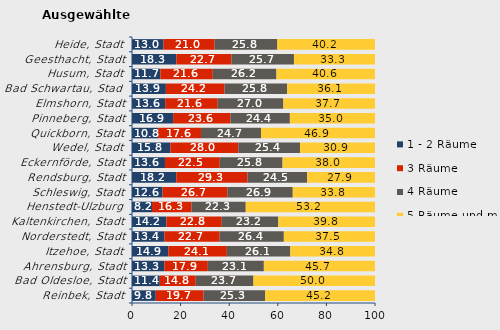
| Category | 1 - 2 Räume | 3 Räume | 4 Räume | 5 Räume und mehr |
|---|---|---|---|---|
| Reinbek, Stadt | 9.788 | 19.687 | 25.333 | 45.192 |
| Bad Oldesloe, Stadt | 11.438 | 14.807 | 23.739 | 50.016 |
| Ahrensburg, Stadt | 13.311 | 17.899 | 23.051 | 45.738 |
| Itzehoe, Stadt | 14.946 | 24.097 | 26.113 | 34.844 |
| Norderstedt, Stadt | 13.386 | 22.683 | 26.416 | 37.515 |
| Kaltenkirchen, Stadt | 14.152 | 22.8 | 23.243 | 39.804 |
| Henstedt-Ulzburg | 8.218 | 16.253 | 22.34 | 53.189 |
| Schleswig, Stadt | 12.588 | 26.651 | 26.924 | 33.837 |
| Rendsburg, Stadt | 18.233 | 29.318 | 24.533 | 27.916 |
| Eckernförde, Stadt | 13.569 | 22.549 | 25.838 | 38.044 |
| Wedel, Stadt | 15.791 | 27.951 | 25.389 | 30.869 |
| Quickborn, Stadt | 10.765 | 17.637 | 24.703 | 46.896 |
| Pinneberg, Stadt | 16.927 | 23.616 | 24.431 | 35.026 |
| Elmshorn, Stadt | 13.648 | 21.638 | 27.015 | 37.699 |
| Bad Schwartau, Stadt | 13.939 | 24.155 | 25.762 | 36.144 |
| Husum, Stadt | 11.675 | 21.575 | 26.192 | 40.558 |
| Geesthacht, Stadt | 18.266 | 22.676 | 25.71 | 33.348 |
| Heide, Stadt | 12.982 | 21.026 | 25.821 | 40.171 |